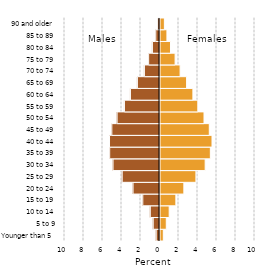
| Category | Series 0 |
|---|---|
| Younger than 5 | 0.35 |
| 5 to 9 | 0.662 |
| 10 to 14 | 0.966 |
| 15 to 19 | 1.67 |
| 20 to 24 | 2.511 |
| 25 to 29 | 3.782 |
| 30 to 34 | 4.755 |
| 35 to 39 | 5.3 |
| 40 to 44 | 5.475 |
| 45 to 49 | 5.188 |
| 50 to 54 | 4.633 |
| 55 to 59 | 3.979 |
| 60 to 64 | 3.463 |
| 65 to 69 | 2.8 |
| 70 to 74 | 2.117 |
| 75 to 79 | 1.59 |
| 80 to 84 | 1.105 |
| 85 to 89 | 0.729 |
| 90 and older | 0.462 |